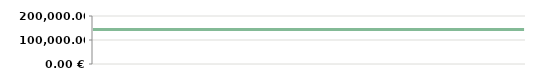
| Category | JAHR   |
|---|---|
| 2013-04-23 | 143800 |
| 2013-04-25 | 143800 |
| 2013-05-07 | 143800 |
| 2013-05-14 | 143800 |
| 2013-05-14 | 143800 |
| 2013-05-29 | 143800 |
| 2013-06-10 | 143800 |
| 2013-06-21 | 143800 |
| 2013-07-06 | 143800 |
| 2013-08-05 | 143800 |
| 2013-08-19 | 143800 |
| 2013-09-04 | 143800 |
| 2013-09-20 | 143800 |
| 2013-09-25 | 143800 |
| 2013-10-15 | 143800 |
| 2013-11-05 | 143800 |
| 2013-11-26 | 143800 |
| 2013-11-30 | 143800 |
| 2013-12-11 | 143800 |